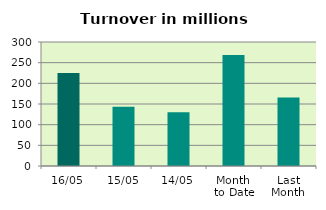
| Category | Series 0 |
|---|---|
| 16/05 | 224.952 |
| 15/05 | 143.279 |
| 14/05 | 130.269 |
| Month 
to Date | 268.471 |
| Last
Month | 165.638 |